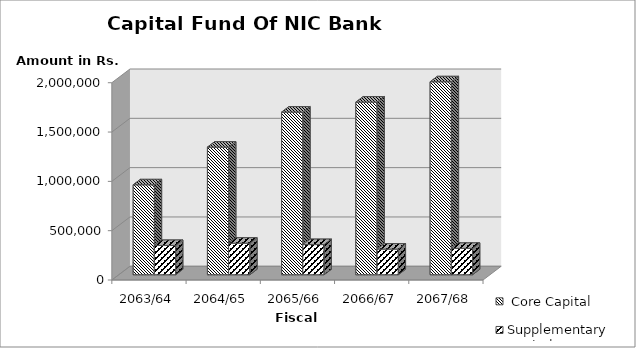
| Category |  Core Capital | Supplementary Capital |
|---|---|---|
| 2063/64 | 911806.55 | 296801.24 |
| 2064/65 | 1293750.76 | 319880.06 |
| 2065/66 | 1649007.42 | 305927.35 |
| 2066/67 | 1750459.21 | 260102.26 |
| 2067/68 | 1956125.42 | 267647.02 |